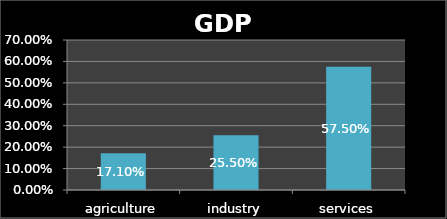
| Category | Series 0 |
|---|---|
| agriculture | 0.171 |
| industry | 0.255 |
| services | 0.575 |